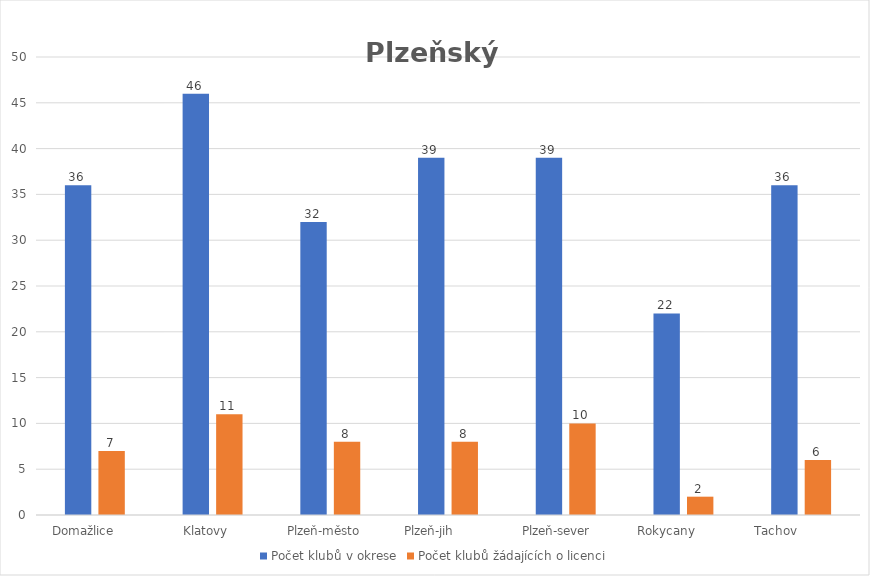
| Category | Počet klubů v okrese | Počet klubů žádajících o licenci |
|---|---|---|
| Domažlice      | 36 | 7 |
| Klatovy    | 46 | 11 |
| Plzeň-město   | 32 | 8 |
| Plzeň-jih          | 39 | 8 |
| Plzeň-sever     | 39 | 10 |
| Rokycany         | 22 | 2 |
| Tachov             | 36 | 6 |